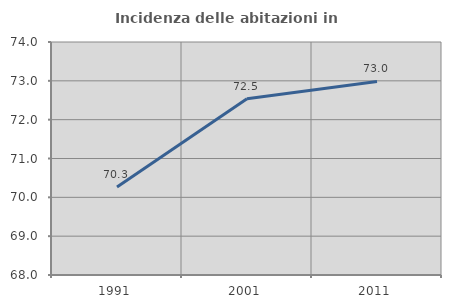
| Category | Incidenza delle abitazioni in proprietà  |
|---|---|
| 1991.0 | 70.267 |
| 2001.0 | 72.537 |
| 2011.0 | 72.985 |